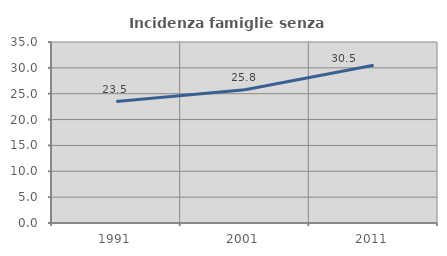
| Category | Incidenza famiglie senza nuclei |
|---|---|
| 1991.0 | 23.473 |
| 2001.0 | 25.754 |
| 2011.0 | 30.521 |